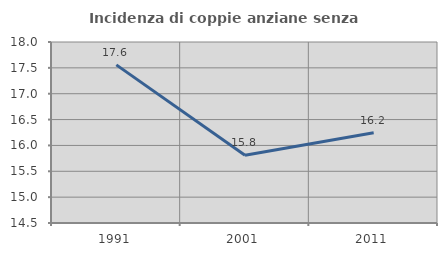
| Category | Incidenza di coppie anziane senza figli  |
|---|---|
| 1991.0 | 17.557 |
| 2001.0 | 15.809 |
| 2011.0 | 16.245 |